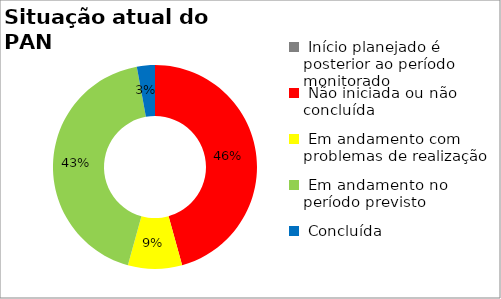
| Category | Series 0 |
|---|---|
|  Início planejado é posterior ao período monitorado | 0 |
|  Não iniciada ou não concluída | 0.457 |
|  Em andamento com problemas de realização | 0.086 |
|  Em andamento no período previsto  | 0.429 |
|  Concluída | 0.029 |